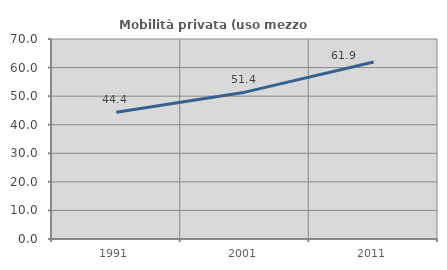
| Category | Mobilità privata (uso mezzo privato) |
|---|---|
| 1991.0 | 44.397 |
| 2001.0 | 51.397 |
| 2011.0 | 61.94 |